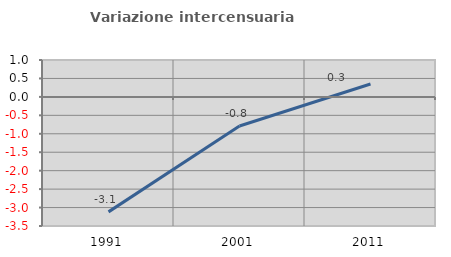
| Category | Variazione intercensuaria annua |
|---|---|
| 1991.0 | -3.117 |
| 2001.0 | -0.79 |
| 2011.0 | 0.348 |